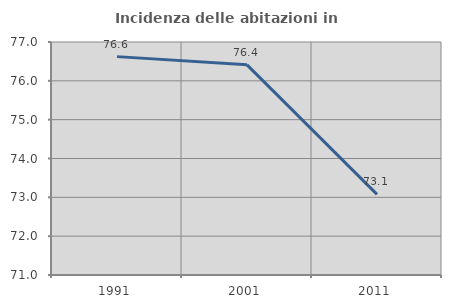
| Category | Incidenza delle abitazioni in proprietà  |
|---|---|
| 1991.0 | 76.623 |
| 2001.0 | 76.412 |
| 2011.0 | 73.077 |